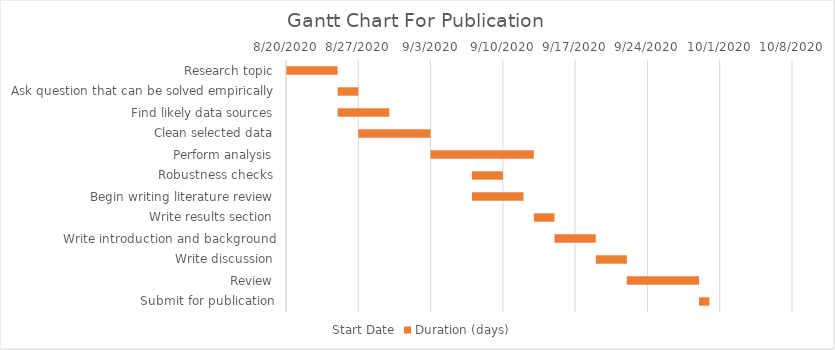
| Category | Start Date | Duration (days) |
|---|---|---|
| Research topic | 8/20/20 | 5 |
| Ask question that can be solved empirically | 8/25/20 | 2 |
| Find likely data sources | 8/25/20 | 5 |
| Clean selected data | 8/27/20 | 7 |
| Perform analysis | 9/3/20 | 10 |
| Robustness checks | 9/7/20 | 3 |
| Begin writing literature review | 9/7/20 | 5 |
| Write results section | 9/13/20 | 2 |
| Write introduction and background | 9/15/20 | 4 |
| Write discussion | 9/19/20 | 3 |
| Review | 9/22/20 | 7 |
| Submit for publication | 9/29/20 | 1 |